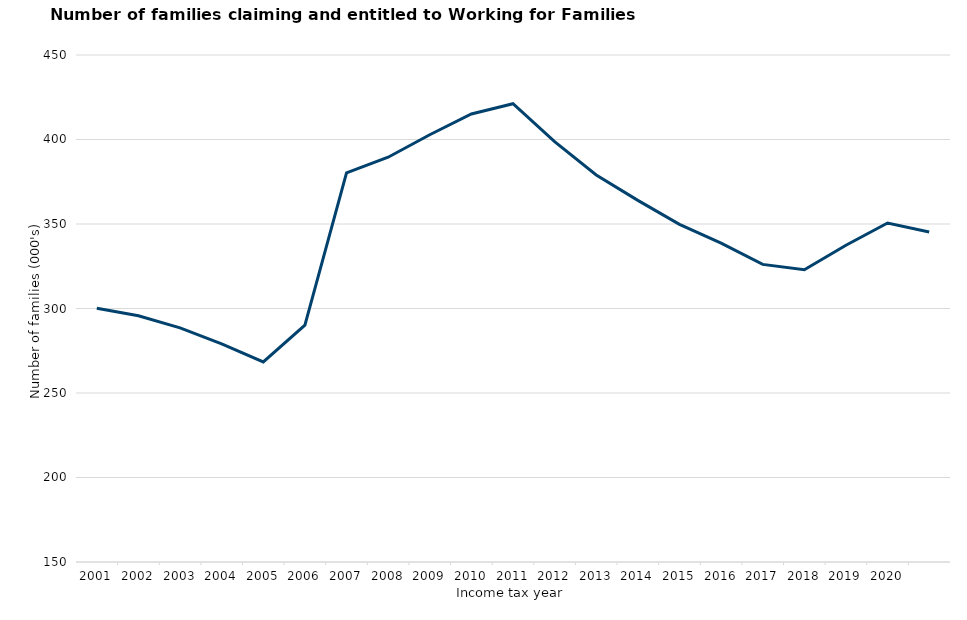
| Category | Series 0 |
|---|---|
| 2001-03-01 | 300.1 |
| 2002-03-01 | 295.7 |
| 2003-03-01 | 288.5 |
| 2004-03-01 | 279.1 |
| 2005-03-01 | 268.4 |
| 2006-03-01 | 290.1 |
| 2007-03-01 | 380.3 |
| 2008-03-01 | 389.5 |
| 2009-03-01 | 402.8 |
| 2010-03-01 | 415.1 |
| 2011-03-01 | 421.2 |
| 2012-03-01 | 398.7 |
| 2013-03-01 | 379 |
| 2014-03-01 | 364 |
| 2015-03-01 | 349.8 |
| 2016-03-01 | 338.7 |
| 2017-03-01 | 326.1 |
| 2018-03-01 | 322.888 |
| 2019-03-01 | 337.4 |
| 2020-03-01 | 350.6 |
| 2021-03-01 | 345.3 |